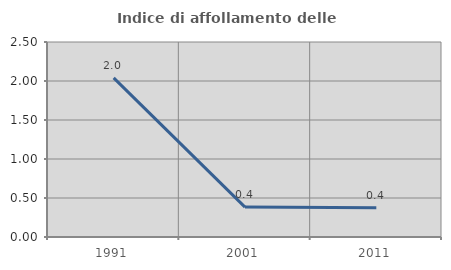
| Category | Indice di affollamento delle abitazioni  |
|---|---|
| 1991.0 | 2.041 |
| 2001.0 | 0.384 |
| 2011.0 | 0.374 |